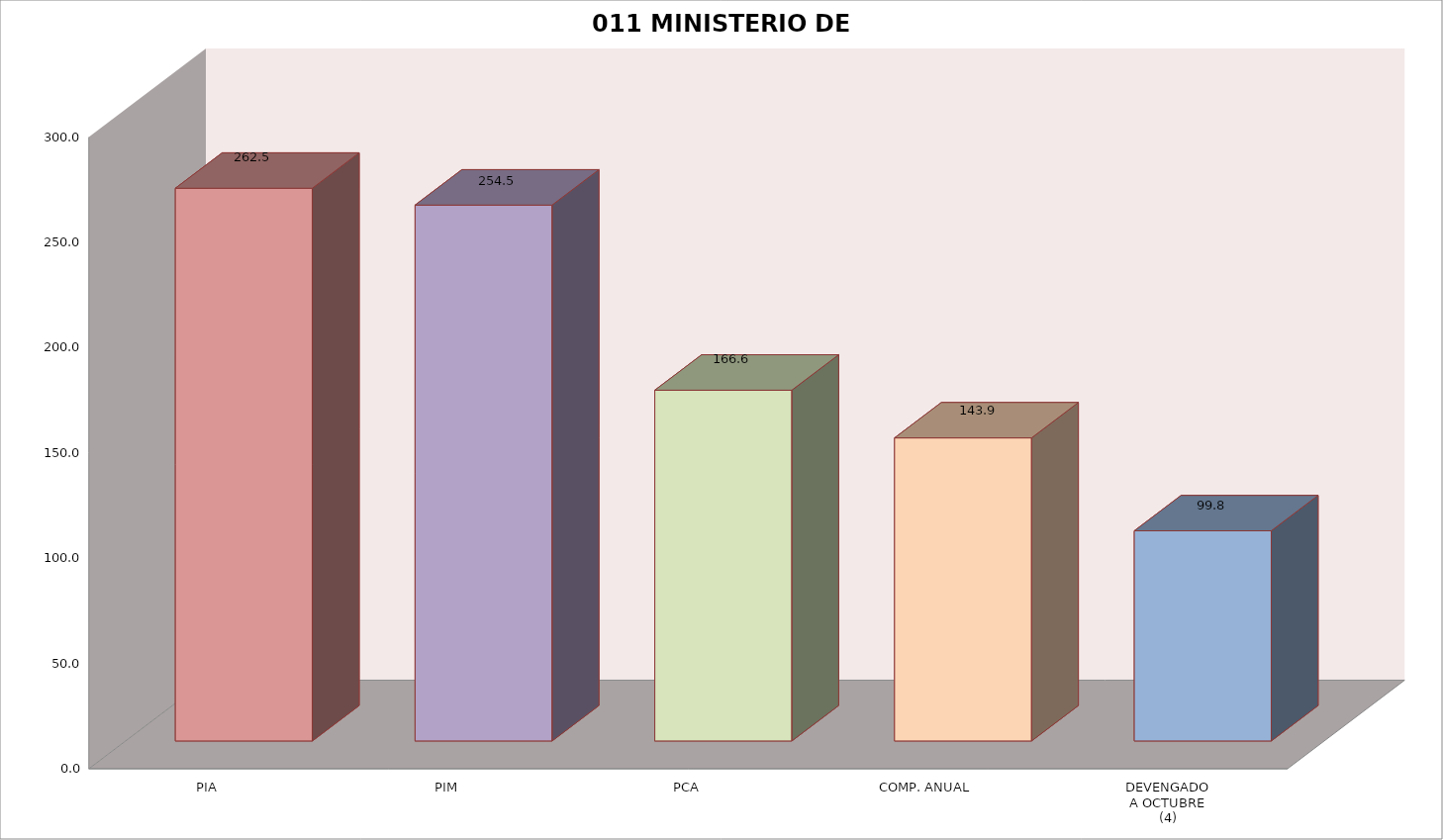
| Category | 011 MINISTERIO DE SALUD |
|---|---|
| PIA | 262.508 |
| PIM | 254.515 |
| PCA | 166.602 |
| COMP. ANUAL | 143.936 |
| DEVENGADO
A OCTUBRE
(4) | 99.808 |